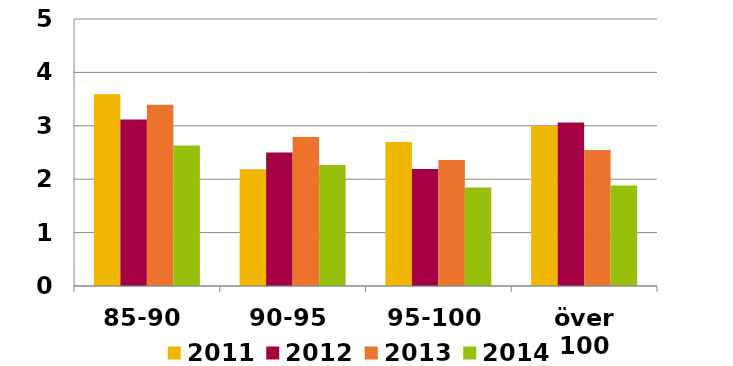
| Category | 2011 | 2012 | 2013 | 2014 |
|---|---|---|---|---|
| 85-90 | 3.591 | 3.116 | 3.393 | 2.633 |
| 90-95 | 2.185 | 2.498 | 2.792 | 2.268 |
| 95-100 | 2.698 | 2.189 | 2.36 | 1.842 |
| över 100 | 2.998 | 3.061 | 2.548 | 1.88 |